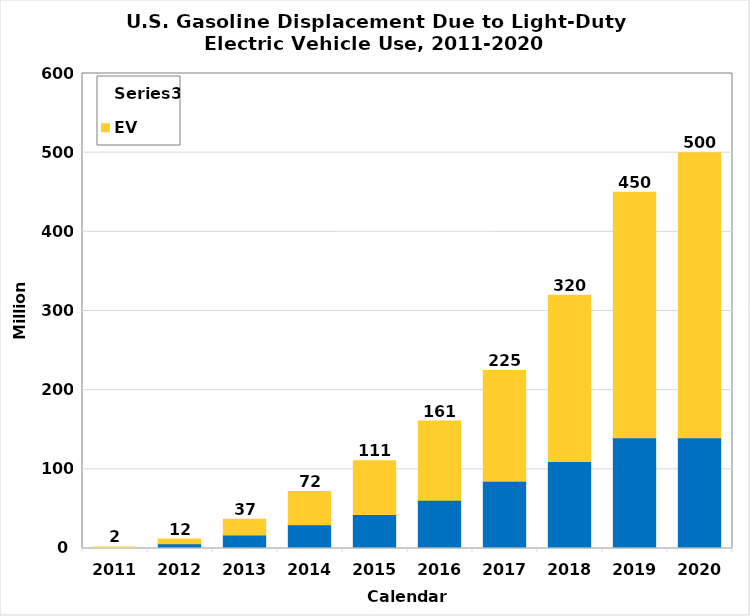
| Category | PHEV | EV | Series 2 |
|---|---|---|---|
| 2011.0 | 1 | 1 | 2 |
| 2012.0 | 6 | 6 | 12 |
| 2013.0 | 17 | 20 | 37 |
| 2014.0 | 30 | 42 | 72 |
| 2015.0 | 43 | 68 | 111 |
| 2016.0 | 61 | 100 | 161 |
| 2017.0 | 85 | 140 | 225 |
| 2018.0 | 110 | 210 | 320 |
| 2019.0 | 140 | 310 | 450 |
| 2020.0 | 140 | 360 | 500 |